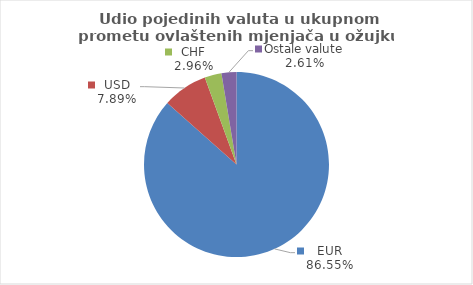
| Category | Series 0 |
|---|---|
| EUR | 86.551 |
| USD | 7.887 |
| CHF | 2.952 |
| Ostale valute | 2.61 |